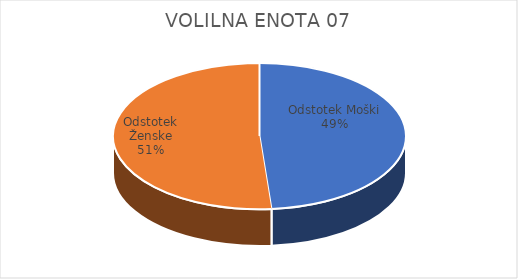
| Category | VOLILNA ENOTA 07 | #REF! | Slovenija skupaj |
|---|---|---|---|
| Odstotek Moški | 11.82 |  | 13.7 |
| Odstotek Ženske | 12.45 |  | 14.52 |